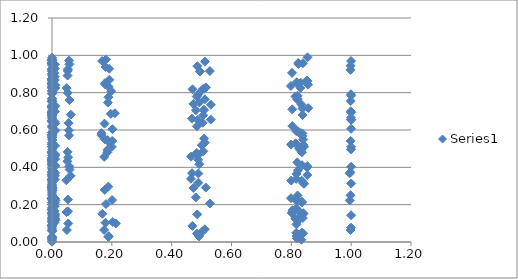
| Category | Series 0 |
|---|---|
| 2.0123843859555475e-10 | 0.914 |
| 2.1284873776763067e-10 | 0.28 |
| 2.4249087996374483e-10 | 0.439 |
| 2.516043418277026e-10 | 0.441 |
| 2.564209724702538e-10 | 0.317 |
| 2.660455700669723e-10 | 0.074 |
| 2.730200291383123e-10 | 0.85 |
| 3.0289745515244437e-10 | 0.025 |
| 3.2020751368826646e-10 | 0.001 |
| 3.2856602494830163e-10 | 0.797 |
| 3.408278143051066e-10 | 0.767 |
| 4.097851320816054e-10 | 0.331 |
| 7.349655657294522e-09 | 0.622 |
| 7.65018932688669e-09 | 0.977 |
| 7.73707583981094e-09 | 0.953 |
| 8.053008278244601e-09 | 0.427 |
| 8.718170969962843e-09 | 0.125 |
| 9.017666419560588e-09 | 0.867 |
| 9.073001933340815e-09 | 0.146 |
| 9.175573883879208e-09 | 0.36 |
| 9.384345860370436e-09 | 0.29 |
| 9.490340358498547e-09 | 0.183 |
| 9.548495748271502e-09 | 0.726 |
| 9.71781717434907e-09 | 0.302 |
| 9.875696351178392e-09 | 0.57 |
| 1.0112151615350308e-08 | 0.42 |
| 1.0686748233231446e-08 | 0.794 |
| 1.1119259050346358e-08 | 0.376 |
| 1.1244268139276162e-08 | 0.96 |
| 1.1512530348595553e-08 | 0.767 |
| 1.1698698931164805e-08 | 0.175 |
| 1.1904995249875154e-08 | 0.754 |
| 1.1977496901092873e-08 | 0.726 |
| 1.2385362527585035e-08 | 0.756 |
| 1.409043215088435e-08 | 0.015 |
| 1.465629644231093e-08 | 0.357 |
| 2.0296841910398058e-07 | 0.09 |
| 2.126493957548408e-07 | 0.903 |
| 2.3696336486193496e-07 | 0.511 |
| 2.4433195648884153e-07 | 0.927 |
| 2.482074914962463e-07 | 0.432 |
| 2.5591380676002896e-07 | 0.464 |
| 2.614676844095914e-07 | 0.849 |
| 2.849876462575096e-07 | 0.414 |
| 2.9842655961281014e-07 | 0.67 |
| 3.0486981994032667e-07 | 0.029 |
| 3.1427016446304065e-07 | 0.721 |
| 3.4430345774041037e-07 | 0.415 |
| 3.453782721627504e-07 | 0.926 |
| 3.604348686617844e-07 | 0.644 |
| 3.6155830554331664e-07 | 0.956 |
| 3.660939813728588e-07 | 0.973 |
| 4.0089252118366086e-07 | 0.531 |
| 4.021375650303851e-07 | 0.875 |
| 4.131385414167058e-07 | 0.479 |
| 4.144203041751622e-07 | 0.892 |
| 4.1957669884489407e-07 | 0.483 |
| 4.208777500249124e-07 | 0.978 |
| 4.323733188605524e-07 | 0.238 |
| 4.3371267620116207e-07 | 0.126 |
| 4.415914221628172e-07 | 0.693 |
| 4.429583477603559e-07 | 0.695 |
| 4.805906362380123e-07 | 0.453 |
| 4.820739669948474e-07 | 0.824 |
| 5.028477053289416e-07 | 0.199 |
| 5.043973114204387e-07 | 0.133 |
| 5.135123268568432e-07 | 0.17 |
| 5.15093650492679e-07 | 0.09 |
| 5.290640899266363e-07 | 0.308 |
| 5.306916223052749e-07 | 0.061 |
| 6.146551888686216e-07 | 0.845 |
| 6.165361701717115e-07 | 0.573 |
| 6.31041391409473e-06 | 0.559 |
| 6.328080709409236e-06 | 0.479 |
| 6.515872484718176e-06 | 0.652 |
| 6.534090027938288e-06 | 0.697 |
| 6.574957987470465e-06 | 0.828 |
| 6.593333766484945e-06 | 0.294 |
| 6.78865616427812e-06 | 0.9 |
| 6.807603706784335e-06 | 0.232 |
| 7.232997842801017e-06 | 0.434 |
| 7.253131642748934e-06 | 0.293 |
| 7.430741538597282e-06 | 0.111 |
| 7.451402164979064e-06 | 0.235 |
| 7.467126288674207e-06 | 0.287 |
| 7.4878837799606925e-06 | 0.352 |
| 7.534448426711712e-06 | 0.686 |
| 7.555385088250692e-06 | 0.226 |
| 7.670992076103872e-06 | 0.377 |
| 7.692291906661945e-06 | 0.02 |
| 7.740072911208374e-06 | 0.929 |
| 7.761556363779417e-06 | 0.336 |
| 7.777906641504018e-06 | 0.769 |
| 7.79949062674656e-06 | 0.154 |
| 7.8877884321269e-06 | 0.56 |
| 7.909664269738018e-06 | 0.691 |
| 7.989885044339246e-06 | 0.401 |
| 8.012031887362622e-06 | 0.441 |
| 8.142160156747786e-06 | 0.107 |
| 8.16471090084991e-06 | 0.574 |
| 8.509139966817988e-06 | 0.97 |
| 8.53266267200566e-06 | 0.234 |
| 8.78264799454859e-06 | 0.676 |
| 8.806893819623011e-06 | 0.987 |
| 8.86128198266205e-06 | 0.524 |
| 8.885735509260473e-06 | 0.448 |
| 9.029410899657642e-06 | 0.856 |
| 9.054308228035128e-06 | 0.438 |
| 9.145605559635225e-06 | 0.23 |
| 9.170809374224552e-06 | 0.201 |
| 9.27391030061177e-06 | 0.252 |
| 9.299452331466796e-06 | 0.475 |
| 9.318891065062012e-06 | 0.834 |
| 9.34455161464139e-06 | 0.651 |
| 9.570881227905534e-06 | 0.663 |
| 9.597205245222242e-06 | 0.646 |
| 1.0606206469333214e-05 | 0.118 |
| 1.0635247963876419e-05 | 0.867 |
| 1.0943835182141853e-05 | 0.587 |
| 1.0973760080052698e-05 | 0.274 |
| 8.675395274580344e-05 | 0.159 |
| 8.696857291424382e-05 | 0.828 |
| 8.897024512079107e-05 | 0.75 |
| 8.996016211466051e-05 | 0.958 |
| 9.018228133443155e-05 | 0.084 |
| 9.786876551179167e-05 | 0.155 |
| 9.81093150467191e-05 | 0.973 |
| 0.00010022780295490791 | 0.436 |
| 0.00010035262601062675 | 0.96 |
| 0.00010047383231343468 | 0.849 |
| 0.00010146191651170184 | 0.263 |
| 0.00010171080947726887 | 0.678 |
| 0.00010276820760266549 | 0.341 |
| 0.00010390272288208066 | 0.919 |
| 0.00010415727323455946 | 0.564 |
| 0.0001044986523195154 | 0.509 |
| 0.00010565121552869393 | 0.732 |
| 0.00010590981361826417 | 0.689 |
| 0.00010832130851313019 | 0.064 |
| 0.00011296296213118084 | 0.948 |
| 0.00011323844327231973 | 0.972 |
| 0.00011580725275794336 | 0.494 |
| 0.00011707732300466711 | 0.702 |
| 0.0001173622745706668 | 0.683 |
| 0.00011774441738652323 | 0.569 |
| 0.00011903454361672833 | 0.021 |
| 0.00011932399305787387 | 0.723 |
| 0.00012055361902947489 | 0.615 |
| 0.00012187279338770368 | 0.875 |
| 0.00012202295176351142 | 0.48 |
| 0.0001221687572817583 | 0.299 |
| 0.0001249284124238082 | 0.98 |
| 0.0001311279036804823 | 0.725 |
| 0.00013570720650591384 | 0.328 |
| 0.00013586378897921647 | 0.586 |
| 0.00013718236994727801 | 0.521 |
| 0.00013751331554332104 | 0.176 |
| 0.00014059888372409458 | 0.55 |
| 0.00014752881339652043 | 0.812 |
| 0.00015100393556571732 | 0.81 |
| 0.0001528211439889713 | 0.005 |
| 0.00015641364278391474 | 0.842 |
| 0.00015898592249189512 | 0.211 |
| 0.00016973172307720977 | 0.391 |
| 0.00017577106239763905 | 0.089 |
| 0.00017864220745446313 | 0.483 |
| 0.00018280376986441174 | 0.369 |
| 0.00020521238882941785 | 0.871 |
| 0.001205681298176634 | 0.407 |
| 0.0012349664741614942 | 0.724 |
| 0.0012433427028495695 | 0.531 |
| 0.00127347256711544 | 0.058 |
| 0.0013353286724743806 | 0.334 |
| 0.0013625286842363614 | 0.436 |
| 0.0013675123231788847 | 0.204 |
| 0.001376716422606586 | 0.716 |
| 0.001395317193551474 | 0.153 |
| 0.001404694040181742 | 0.37 |
| 0.0014098200022086115 | 0.807 |
| 0.00142466987017297 | 0.287 |
| 0.0014384180769863753 | 0.326 |
| 0.0014588362299419587 | 0.276 |
| 0.0015076284579293889 | 0.094 |
| 0.0015436258730169741 | 0.864 |
| 0.0015539191033448047 | 0.68 |
| 0.0015758452392378012 | 0.546 |
| 0.0015909342410844929 | 0.117 |
| 0.0016075359634506832 | 0.584 |
| 0.0016133414637460718 | 0.803 |
| 0.0016457264411810506 | 0.362 |
| 0.001776450230748481 | 0.903 |
| 0.0018183204567124983 | 0.176 |
| 0.008248838611417198 | 0.904 |
| 0.008384364521471437 | 0.104 |
| 0.008399189756996599 | 0.929 |
| 0.00846597446733716 | 0.166 |
| 0.00899172065670219 | 0.46 |
| 0.009138106298343862 | 0.191 |
| 0.00914598671101071 | 0.355 |
| 0.009154118043015792 | 0.885 |
| 0.009226244241309769 | 0.928 |
| 0.009294612360775415 | 0.73 |
| 0.009310868828244601 | 0.143 |
| 0.009384096695106307 | 0.644 |
| 0.009406032065405967 | 0.951 |
| 0.00942246242277262 | 0.868 |
| 0.009496473082238615 | 0.135 |
| 0.009650169396785868 | 0.698 |
| 0.009666979819986299 | 0.21 |
| 0.009960326810377377 | 0.336 |
| 0.01012069550475376 | 0.636 |
| 0.010138234827869859 | 0.407 |
| 0.010217237526948315 | 0.126 |
| 0.010240901526594709 | 0.515 |
| 0.010258626320890777 | 0.47 |
| 0.01033846389989234 | 0.444 |
| 0.010414133802247831 | 0.635 |
| 0.010432125364654285 | 0.411 |
| 0.010504240713037767 | 0.371 |
| 0.010513163761943722 | 0.149 |
| 0.010522370795139008 | 0.464 |
| 0.01068142992684914 | 0.727 |
| 0.0106998319255228 | 0.231 |
| 0.011327860996625699 | 0.826 |
| 0.011347249825948386 | 0.598 |
| 0.011434577601193496 | 0.839 |
| 0.011615880806594188 | 0.117 |
| 0.01163570677385138 | 0.222 |
| 0.047926681397543344 | 0.331 |
| 0.04857987146610265 | 0.16 |
| 0.04892758078127738 | 0.824 |
| 0.04959212195001045 | 0.064 |
| 0.051326780263365165 | 0.432 |
| 0.052018312109956354 | 0.892 |
| 0.052024487362549686 | 0.483 |
| 0.05238638129924764 | 0.799 |
| 0.05272381170316878 | 0.916 |
| 0.05308973766006187 | 0.227 |
| 0.05309601833261545 | 0.926 |
| 0.05359950536409357 | 0.164 |
| 0.05380726167127222 | 0.454 |
| 0.05431632904497196 | 0.099 |
| 0.05566311364314363 | 0.637 |
| 0.05640267709046556 | 0.599 |
| 0.05679624636416254 | 0.572 |
| 0.05732857146829698 | 0.972 |
| 0.0575482075837964 | 0.406 |
| 0.05808633560124565 | 0.761 |
| 0.058093101290302596 | 0.952 |
| 0.05885917601950252 | 0.388 |
| 0.06207660008255245 | 0.355 |
| 0.06288553642916007 | 0.682 |
| 0.16528014694852947 | 0.572 |
| 0.16561091967613417 | 0.583 |
| 0.16792940213622176 | 0.97 |
| 0.16826398719019944 | 0.151 |
| 0.17421859374697715 | 0.064 |
| 0.1745621098212557 | 0.456 |
| 0.1756436356942767 | 0.634 |
| 0.17603179221987977 | 0.279 |
| 0.17637785236534528 | 0.55 |
| 0.1769695508710083 | 0.85 |
| 0.17731692142196595 | 0.845 |
| 0.1788030499997324 | 0.103 |
| 0.17915297216308868 | 0.937 |
| 0.18009966368651756 | 0.977 |
| 0.1804513819622756 | 0.203 |
| 0.18497525429562636 | 0.48 |
| 0.1853778952681674 | 0.494 |
| 0.18573685447817417 | 0.545 |
| 0.1868668947378896 | 0.747 |
| 0.18820442926896672 | 0.028 |
| 0.18825206651033327 | 0.297 |
| 0.18861492141442815 | 0.776 |
| 0.18959653228526638 | 0.831 |
| 0.18996119817485224 | 0.031 |
| 0.19110916361527686 | 0.928 |
| 0.19152111025987079 | 0.534 |
| 0.19188835605781837 | 0.869 |
| 0.1966104541864498 | 0.687 |
| 0.1979961456891295 | 0.808 |
| 0.1999794449858046 | 0.509 |
| 0.2010047873520389 | 0.224 |
| 0.2014313954826876 | 0.541 |
| 0.20181169627460332 | 0.605 |
| 0.20300876584785263 | 0.107 |
| 0.21018672219242057 | 0.69 |
| 0.2133205541108137 | 0.099 |
| 0.46455494882844073 | 0.339 |
| 0.46488365452004693 | 0.457 |
| 0.4677212901048254 | 0.661 |
| 0.468050766000257 | 0.369 |
| 0.46939531370324594 | 0.086 |
| 0.4697251901427278 | 0.818 |
| 0.47257282340901496 | 0.289 |
| 0.4729034474526771 | 0.74 |
| 0.4807351240729726 | 0.239 |
| 0.4810675922726531 | 0.706 |
| 0.48393734025601715 | 0.779 |
| 0.4839658054839773 | 0.477 |
| 0.4842705018974237 | 0.045 |
| 0.4842989732134586 | 0.62 |
| 0.48562999827323833 | 0.148 |
| 0.48596351960371315 | 0.942 |
| 0.48717468525276447 | 0.655 |
| 0.4875085306853144 | 0.465 |
| 0.4888422454966358 | 0.791 |
| 0.4888707987680166 | 0.441 |
| 0.48917643637018243 | 0.367 |
| 0.4892049955162899 | 0.318 |
| 0.4911523083885197 | 0.03 |
| 0.4914869701723146 | 0.037 |
| 0.49208947646009404 | 0.417 |
| 0.4924243267586829 | 0.747 |
| 0.4943754121435399 | 0.914 |
| 0.49471071613820533 | 0.913 |
| 0.5003529490451061 | 0.053 |
| 0.5006893982569119 | 0.519 |
| 0.5035930528669529 | 0.639 |
| 0.5039300978919382 | 0.818 |
| 0.5053053264256767 | 0.679 |
| 0.505642679215196 | 0.486 |
| 0.5076081978557668 | 0.706 |
| 0.5079459568089202 | 0.708 |
| 0.5085540156594502 | 0.554 |
| 0.5088919388489218 | 0.821 |
| 0.5108607441420949 | 0.532 |
| 0.5108896504730372 | 0.068 |
| 0.5111990615744799 | 0.967 |
| 0.5112279727889898 | 0.764 |
| 0.5141475441911506 | 0.292 |
| 0.5144864078873235 | 0.828 |
| 0.5275122695014923 | 0.916 |
| 0.527853166059375 | 0.206 |
| 0.5307945527084136 | 0.656 |
| 0.5311359020239407 | 0.735 |
| 0.798567951508738 | 0.836 |
| 0.7988739009991219 | 0.235 |
| 0.7991322360323162 | 0.522 |
| 0.799437920307073 | 0.329 |
| 0.8016866460316698 | 0.157 |
| 0.8022481990871777 | 0.906 |
| 0.8030511388280362 | 0.711 |
| 0.8033549507251835 | 0.621 |
| 0.8036114771398457 | 0.153 |
| 0.8039150169234495 | 0.17 |
| 0.8133693259642903 | 0.125 |
| 0.8136679460538753 | 0.78 |
| 0.8139200800008215 | 0.226 |
| 0.8142184119876777 | 0.529 |
| 0.816261725006111 | 0.338 |
| 0.8164125617557015 | 0.049 |
| 0.8165588193167684 | 0.594 |
| 0.8168096624760707 | 0.179 |
| 0.8169603507415937 | 0.094 |
| 0.81710646417374 | 0.365 |
| 0.8177435152803768 | 0.032 |
| 0.8180398156332187 | 0.019 |
| 0.8182899871286483 | 0.856 |
| 0.8185859925531265 | 0.852 |
| 0.8192892588672411 | 0.764 |
| 0.8198341852644488 | 0.427 |
| 0.820613237852892 | 0.783 |
| 0.820907976542356 | 0.249 |
| 0.8211568269443887 | 0.766 |
| 0.8213019315559259 | 0.594 |
| 0.8214512662122776 | 0.383 |
| 0.8218448200315283 | 0.218 |
| 0.82262094541247 | 0.169 |
| 0.8229145724352092 | 0.116 |
| 0.8231624824399357 | 0.959 |
| 0.8234558068904403 | 0.953 |
| 0.8256128045109267 | 0.503 |
| 0.8261512288535067 | 0.127 |
| 0.830612320306964 | 0.826 |
| 0.8309013623106583 | 0.49 |
| 0.8311453938565824 | 0.853 |
| 0.8314341206894511 | 0.583 |
| 0.8335570189521218 | 0.012 |
| 0.8340868512976974 | 0.736 |
| 0.8348442260687539 | 0.329 |
| 0.8351307330270598 | 0.216 |
| 0.8353726202913931 | 0.48 |
| 0.8355136591904012 | 0.05 |
| 0.8356588053699372 | 0.212 |
| 0.8360413003124605 | 0.411 |
| 0.8367955285928335 | 0.582 |
| 0.8370808408876932 | 0.568 |
| 0.8373217176647674 | 0.715 |
| 0.8376067049777879 | 0.68 |
| 0.8382837044739133 | 0.129 |
| 0.8388081912359159 | 0.957 |
| 0.8395578902159686 | 0.046 |
| 0.8397018754834804 | 0.549 |
| 0.8398414828842291 | 0.154 |
| 0.8400809051694506 | 0.521 |
| 0.8402247232857397 | 0.315 |
| 0.8403641684551337 | 0.152 |
| 0.8424465577101881 | 0.312 |
| 0.8429661865145044 | 0.511 |
| 0.8519905087296934 | 0.865 |
| 0.8524984448925872 | 0.399 |
| 0.8532243828188999 | 0.407 |
| 0.8534989553344371 | 0.359 |
| 0.8537307486950766 | 0.863 |
| 0.8540049698970363 | 0.989 |
| 0.856020344015566 | 0.843 |
| 0.8565231001346281 | 0.717 |
| 0.994834886025575 | 0.368 |
| 0.9953766164735058 | 0.223 |
| 0.9972801019672811 | 0.373 |
| 0.9976697690615814 | 0.922 |
| 0.9976730948771776 | 0.064 |
| 0.9979310104615164 | 0.25 |
| 0.9980324808185859 | 0.944 |
| 0.9982690949720863 | 0.541 |
| 0.9984354006671265 | 0.755 |
| 0.9987275360782343 | 0.7 |
| 0.9991885087208351 | 0.791 |
| 0.9993378741743699 | 0.665 |
| 0.9993947804459166 | 0.496 |
| 0.9995227555283397 | 0.97 |
| 0.9995242620840166 | 0.656 |
| 0.999608160821927 | 0.077 |
| 0.9996786930127619 | 0.143 |
| 0.9997469251263381 | 0.607 |
| 0.9997480220691844 | 0.403 |
| 0.9998563154647021 | 0.784 |
| 0.9999393745145014 | 0.314 |
| 0.9999847993091571 | 0.654 |
| 0.9999958368666434 | 0.694 |
| 0.9999965880209781 | 0.509 |